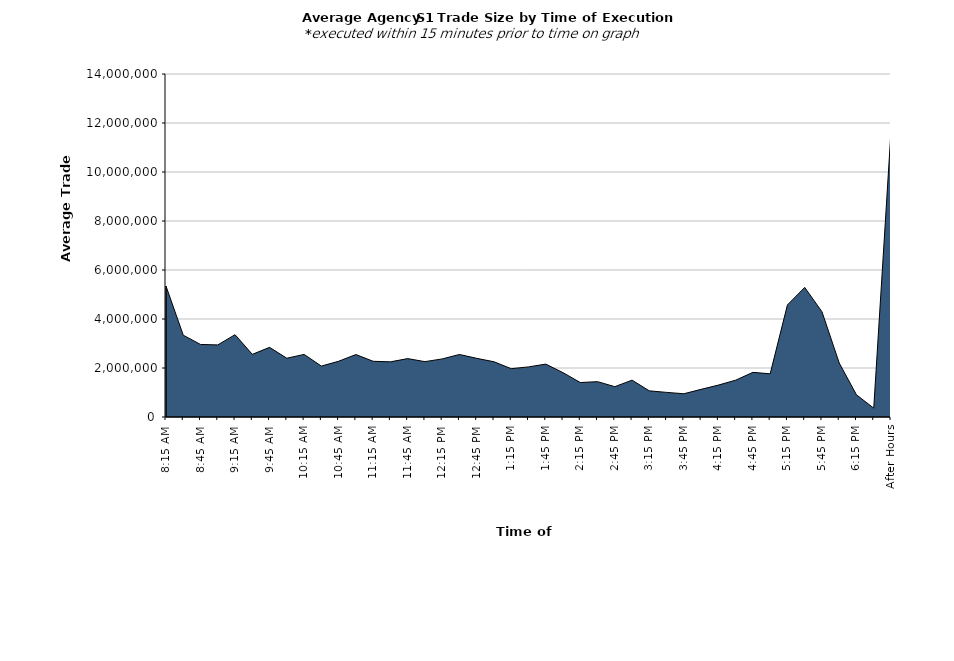
| Category | Series 0 |
|---|---|
| 8:15 AM | 5342972.548 |
| 8:30 AM | 3339257.741 |
| 8:45 AM | 2961470.133 |
| 9:00 AM | 2942541.912 |
| 9:15 AM | 3359935.879 |
| 9:30 AM | 2556923.783 |
| 9:45 AM | 2842777.834 |
| 10:00 AM | 2398791.454 |
| 10:15 AM | 2554528.997 |
| 10:30 AM | 2078629.39 |
| 10:45 AM | 2274656.756 |
| 11:00 AM | 2549650.804 |
| 11:15 AM | 2273824.991 |
| 11:30 AM | 2250672.088 |
| 11:45 AM | 2382680.647 |
| 12:00 PM | 2260101.318 |
| 12:15 PM | 2370427.342 |
| 12:30 PM | 2552151.576 |
| 12:45 PM | 2394504.714 |
| 1:00 PM | 2254660.8 |
| 1:15 PM | 1972529.256 |
| 1:30 PM | 2044854.485 |
| 1:45 PM | 2158844.037 |
| 2:00 PM | 1810436.796 |
| 2:15 PM | 1406486.62 |
| 2:30 PM | 1443070.794 |
| 2:45 PM | 1238143.25 |
| 3:00 PM | 1503914.925 |
| 3:15 PM | 1067431.876 |
| 3:30 PM | 1004688.385 |
| 3:45 PM | 949435.668 |
| 4:00 PM | 1128532.395 |
| 4:15 PM | 1302325.007 |
| 4:30 PM | 1503104.007 |
| 4:45 PM | 1821727.228 |
| 5:00 PM | 1762664.132 |
| 5:15 PM | 4575240.508 |
| 5:30 PM | 5288282.781 |
| 5:45 PM | 4298699.396 |
| 6:00 PM | 2206391.167 |
| 6:15 PM | 904327.778 |
| 6:30 PM | 361940.832 |
| After Hours | 11682775.139 |